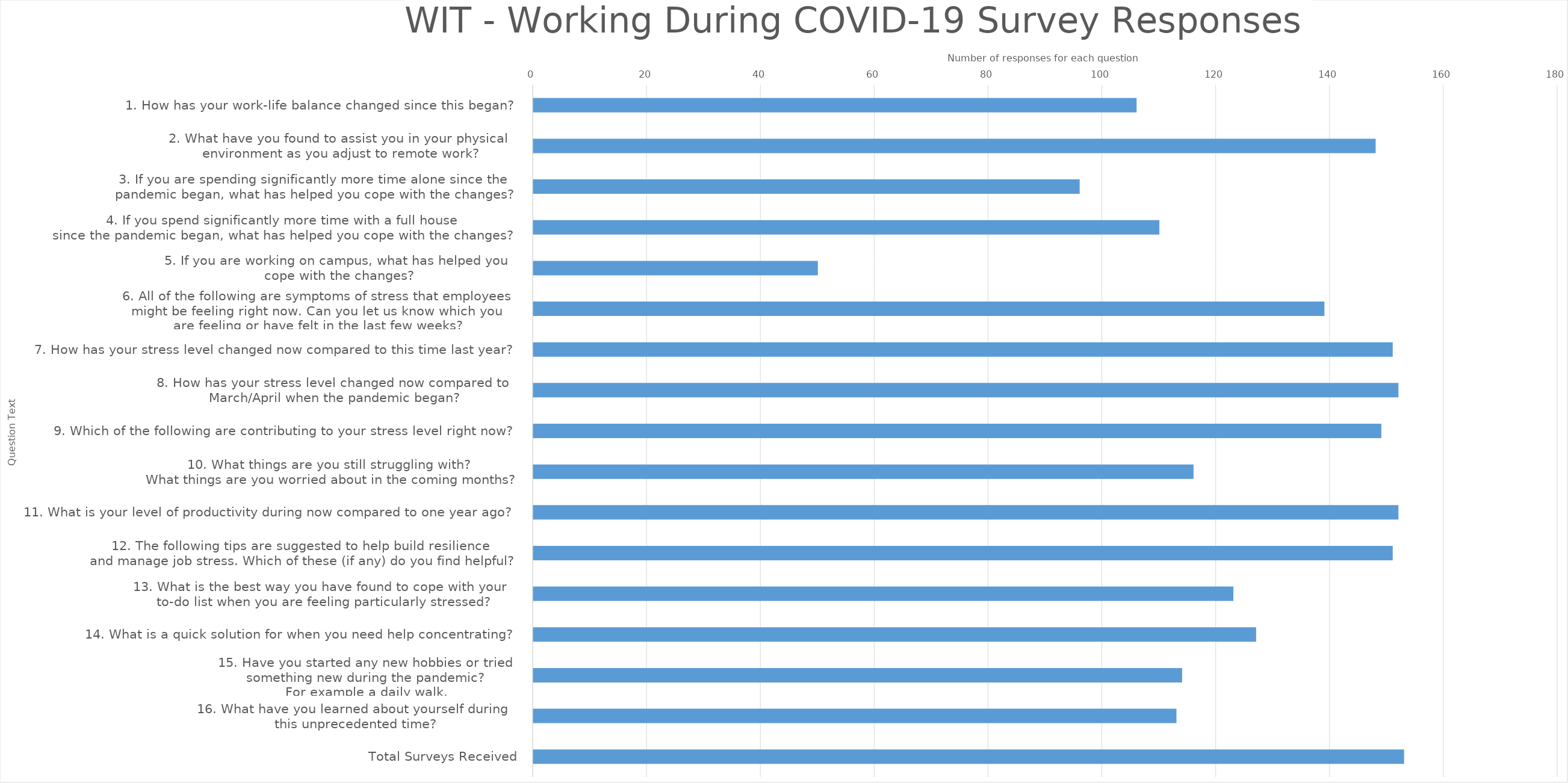
| Category | Total Answered |
|---|---|
| 1. How has your work-life balance changed since this began? | 106 |
| 2. What have you found to assist you in your physical 
environment as you adjust to remote work? | 148 |
| 3. If you are spending significantly more time alone since the 
pandemic began, what has helped you cope with the changes? | 96 |
| 4. If you spend significantly more time with a full house 
since the pandemic began, what has helped you cope with the changes? | 110 |
| 5. If you are working on campus, what has helped you 
cope with the changes? | 50 |
| 6. All of the following are symptoms of stress that employees
 might be feeling right now. Can you let us know which you 
are feeling or have felt in the last few weeks? | 139 |
| 7. How has your stress level changed now compared to this time last year? | 151 |
| 8. How has your stress level changed now compared to 
March/April when the pandemic began? | 152 |
| 9. Which of the following are contributing to your stress level right now? | 149 |
| 10. What things are you still struggling with? 
What things are you worried about in the coming months? | 116 |
| 11. What is your level of productivity during now compared to one year ago? | 152 |
| 12. The following tips are suggested to help build resilience 
and manage job stress. Which of these (if any) do you find helpful? | 151 |
| 13. What is the best way you have found to cope with your 
to-do list when you are feeling particularly stressed? | 123 |
| 14. What is a quick solution for when you need help concentrating? | 127 |
| 15. Have you started any new hobbies or tried
 something new during the pandemic? 
For example a daily walk. | 114 |
| 16. What have you learned about yourself during 
this unprecedented time? | 113 |
| Total Surveys Received | 153 |